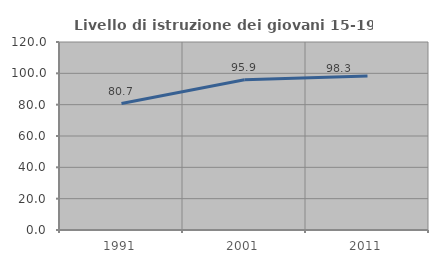
| Category | Livello di istruzione dei giovani 15-19 anni |
|---|---|
| 1991.0 | 80.702 |
| 2001.0 | 95.918 |
| 2011.0 | 98.333 |